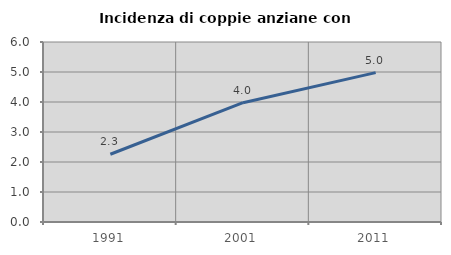
| Category | Incidenza di coppie anziane con figli |
|---|---|
| 1991.0 | 2.259 |
| 2001.0 | 3.976 |
| 2011.0 | 4.98 |